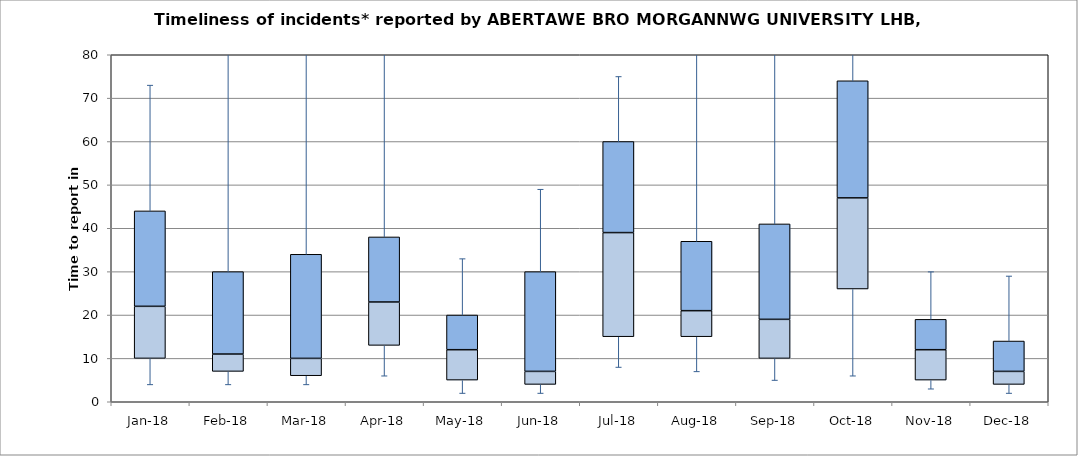
| Category | Series 0 | Series 1 | Series 2 |
|---|---|---|---|
| Jan-18 | 10 | 12 | 22 |
| Feb-18 | 7 | 4 | 19 |
| Mar-18 | 6 | 4 | 24 |
| Apr-18 | 13 | 10 | 15 |
| May-18 | 5 | 7 | 8 |
| Jun-18 | 4 | 3 | 23 |
| Jul-18 | 15 | 24 | 21 |
| Aug-18 | 15 | 6 | 16 |
| Sep-18 | 10 | 9 | 22 |
| Oct-18 | 26 | 21 | 27 |
| Nov-18 | 5 | 7 | 7 |
| Dec-18 | 4 | 3 | 7 |